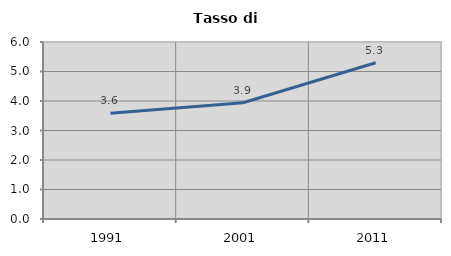
| Category | Tasso di disoccupazione   |
|---|---|
| 1991.0 | 3.587 |
| 2001.0 | 3.943 |
| 2011.0 | 5.298 |